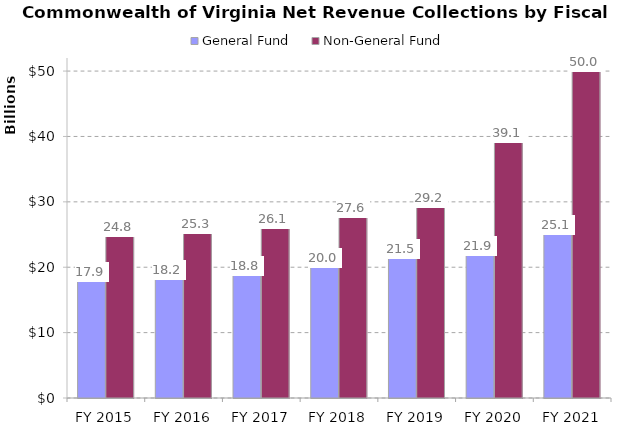
| Category | General Fund | Non-General Fund  |
|---|---|---|
| FY 2015 | 17856571000 | 24805219000 |
| FY 2016 | 18170460000 | 25279826000 |
| FY 2017 | 18839827000 | 26073523000 |
| FY 2018 | 20024020000 | 27608806000 |
| FY 2019 | 21467094000 | 29225445000 |
| FY 2020 | 21903571000 | 39119584000 |
| FY 2021 | 25083803000 | 50027817000 |